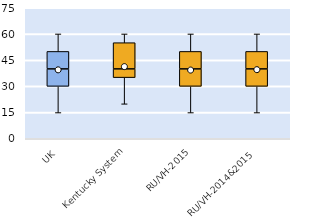
| Category | 25th | 50th | 75th |
|---|---|---|---|
| UK | 30 | 10 | 10 |
| Kentucky System | 35 | 5 | 15 |
| RU/VH-2015 | 30 | 10 | 10 |
| RU/VH-2014&2015 | 30 | 10 | 10 |